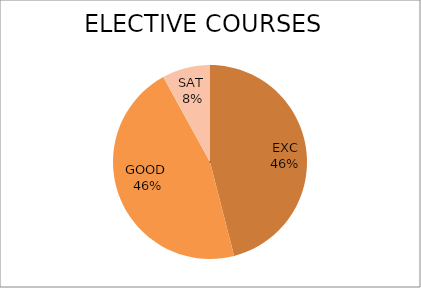
| Category | Series 0 |
|---|---|
| EXC | 46 |
| GOOD  | 46 |
| SAT  | 8 |